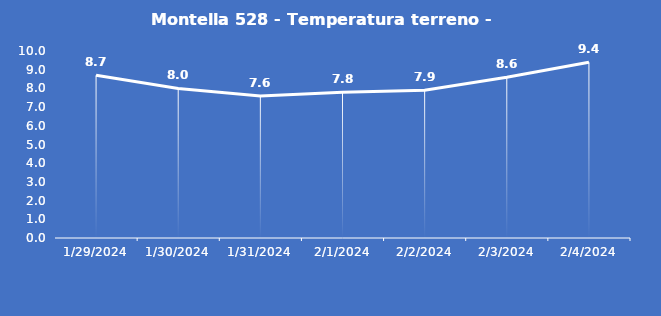
| Category | Montella 528 - Temperatura terreno - Grezzo (°C) |
|---|---|
| 1/29/24 | 8.7 |
| 1/30/24 | 8 |
| 1/31/24 | 7.6 |
| 2/1/24 | 7.8 |
| 2/2/24 | 7.9 |
| 2/3/24 | 8.6 |
| 2/4/24 | 9.4 |